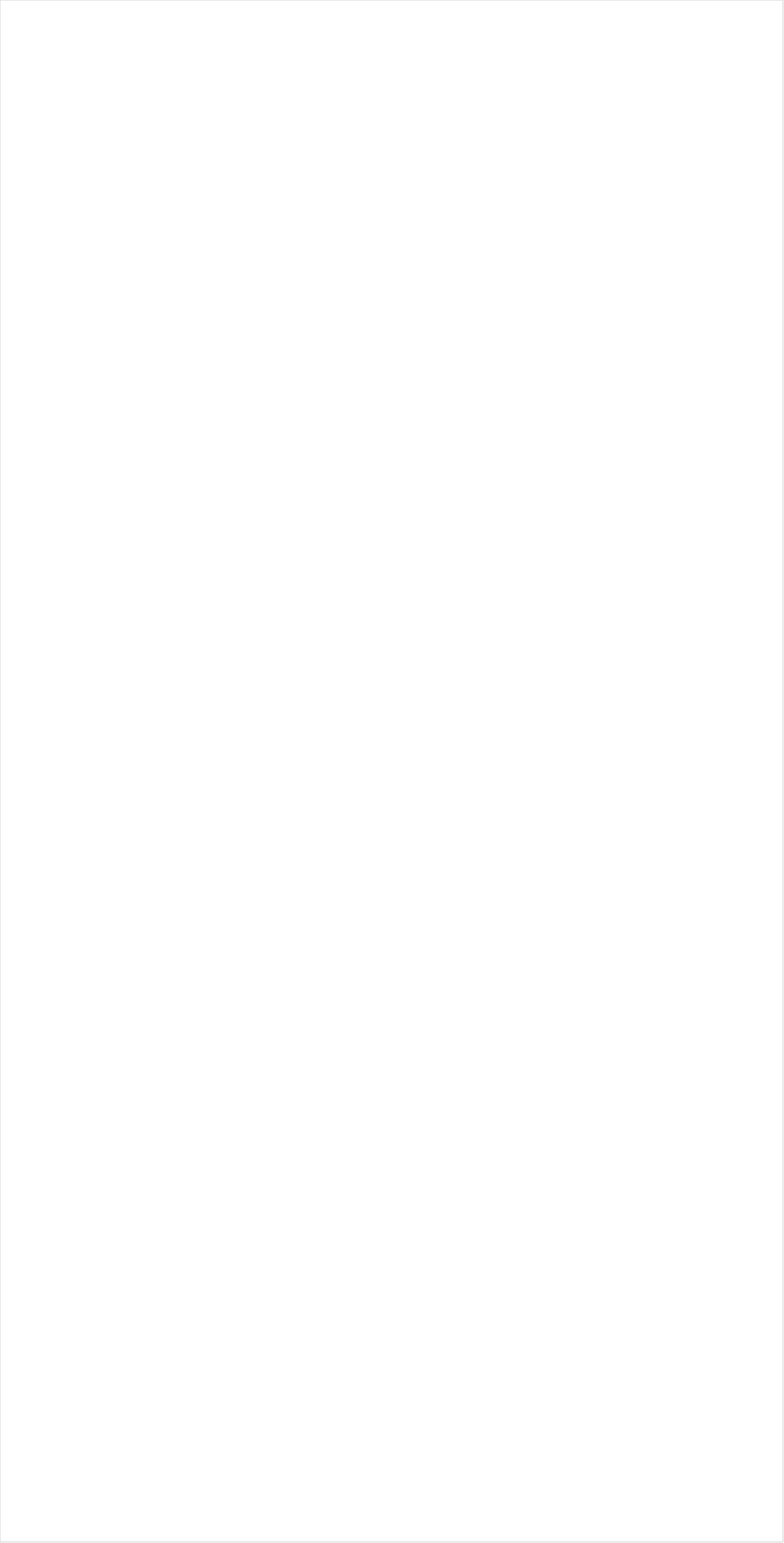
| Category | Total |
|---|---|
| Galavision | -0.944 |
| Telemundo | -0.924 |
| UniMas | -0.914 |
| TUDN | -0.907 |
| Univision | -0.874 |
| BET Her | -0.825 |
| NBC Universo | -0.817 |
| BET | -0.707 |
| VH1 | -0.699 |
| MTV2 | -0.65 |
| TV ONE | -0.63 |
| NBA TV | -0.528 |
| Teen Nick | -0.491 |
| MSNBC | -0.461 |
| Nick Jr. | -0.448 |
| Lifetime Movies | -0.428 |
| Nick | -0.419 |
| Disney Channel | -0.407 |
| Nick Toons | -0.406 |
| CNN | -0.394 |
| Adult Swim | -0.392 |
| Disney XD | -0.375 |
| Oprah Winfrey Network | -0.374 |
| Discovery Life Channel | -0.355 |
| Disney Junior US | -0.33 |
| Nick@Nite | -0.321 |
| TLC | -0.316 |
| Universal Kids | -0.298 |
| MyNetworkTV | -0.273 |
| Lifetime | -0.239 |
| WE TV | -0.238 |
| BRAVO | -0.221 |
| Viceland | -0.191 |
| FX Movie Channel | -0.144 |
| Freeform | -0.13 |
| E! | -0.125 |
| MTV | -0.122 |
| FXX | -0.116 |
| Comedy Central | -0.108 |
| Investigation Discovery | -0.09 |
| FX | -0.08 |
| Tennis Channel | -0.065 |
| Discovery Family Channel | -0.055 |
| Hallmark Movies & Mysteries | -0.055 |
| SYFY | -0.039 |
| Logo | -0.037 |
| HGTV | -0.034 |
| truTV | -0.03 |
| ION | -0.021 |
| OXYGEN | -0.006 |
| ESPN2 | -0.002 |
| ESPN Deportes | 0.008 |
| PBS | 0.008 |
| Hallmark | 0.011 |
| Headline News | 0.022 |
| TBS | 0.027 |
| CNBC | 0.043 |
| Travel | 0.053 |
| Bloomberg HD | 0.069 |
| UP TV | 0.074 |
| Great American Country | 0.106 |
| Game Show | 0.107 |
| AMC | 0.111 |
| TNT | 0.113 |
| BBC America | 0.114 |
| NFL Network | 0.12 |
| CW | 0.121 |
| POP | 0.129 |
| ABC | 0.134 |
| Science Channel | 0.136 |
| Food Network | 0.138 |
| Paramount Network | 0.141 |
| Cooking Channel | 0.153 |
| USA Network | 0.156 |
| NBC | 0.198 |
| Golf | 0.214 |
| SundanceTV | 0.24 |
| Independent Film (IFC) | 0.257 |
| ESPN | 0.263 |
| CBS | 0.266 |
| Ovation | 0.266 |
| Reelz Channel | 0.268 |
| TV LAND | 0.278 |
| A&E | 0.289 |
| CMTV | 0.289 |
| MLB Network | 0.303 |
| Fox Business | 0.345 |
| National Geographic Wild | 0.347 |
| ESPNU | 0.361 |
| Big Ten Network | 0.369 |
| Olympic Channel | 0.389 |
| American Heroes Channel | 0.4 |
| ESPNEWS | 0.421 |
| WGN America | 0.424 |
| Fox News | 0.437 |
| Smithsonian | 0.441 |
| Destination America | 0.461 |
| Animal Planet | 0.537 |
| INSP | 0.547 |
| DIY | 0.559 |
| PAC-12 Network | 0.57 |
| National Geographic | 0.597 |
| Weather Channel | 0.67 |
| NHL | 0.686 |
| History Channel | 0.719 |
| Discovery Channel | 0.751 |
| FYI | 0.909 |
| The Sportsman Channel | 1.041 |
| Outdoor Channel | 1.091 |
| Motor Trend Network | 1.142 |
| RFD TV | 1.232 |
| CBS Sports | 1.511 |
| NBC Sports | 1.897 |
| FOX | 2.841 |
| FOX Sports 2 | 3.538 |
| Fox Sports 1 | 8.314 |
| FXDEP | 8.602 |